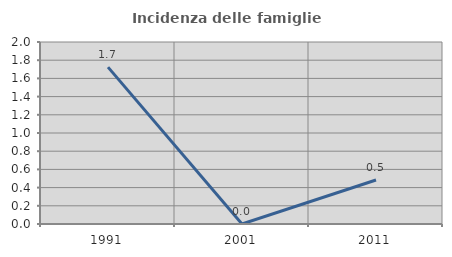
| Category | Incidenza delle famiglie numerose |
|---|---|
| 1991.0 | 1.724 |
| 2001.0 | 0 |
| 2011.0 | 0.483 |